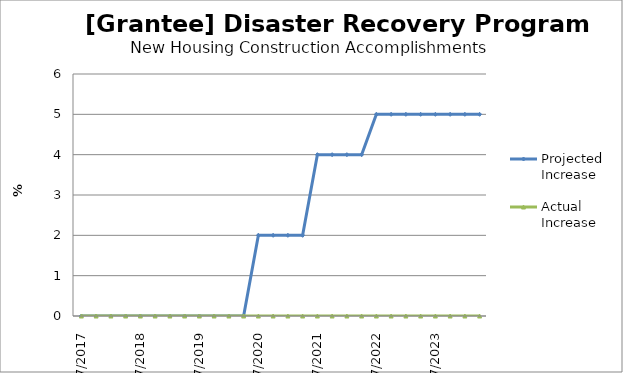
| Category | Projected Increase | Actual Increase |
|---|---|---|
| 7/2017 | 0 | 0 |
| 10/2017 | 0 | 0 |
| 1/2018 | 0 | 0 |
| 4/2018 | 0 | 0 |
| 7/2018 | 0 | 0 |
| 10/2018 | 0 | 0 |
| 1/2019 | 0 | 0 |
| 4/2019 | 0 | 0 |
| 7/2019 | 0 | 0 |
| 10/2019 | 0 | 0 |
| 1/2020 | 0 | 0 |
| 4/2020 | 0 | 0 |
| 7/2020 | 2 | 0 |
| 10/2020 | 2 | 0 |
| 1/2021 | 2 | 0 |
| 4/2021 | 2 | 0 |
| 7/2021 | 4 | 0 |
| 10/2021 | 4 | 0 |
| 1/2022 | 4 | 0 |
| 4/2022 | 4 | 0 |
| 7/2022 | 5 | 0 |
| 10/2022 | 5 | 0 |
| 1/2023 | 5 | 0 |
| 4/2023 | 5 | 0 |
| 7/2023 | 5 | 0 |
| 10/2023 | 5 | 0 |
| 1/2024 | 5 | 0 |
| 4/2024 | 5 | 0 |